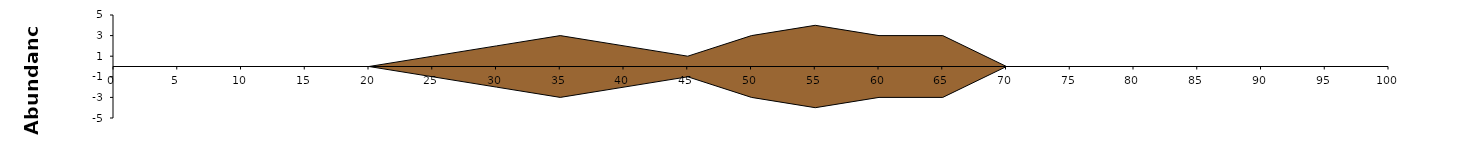
| Category | Series1 | Series2 |
|---|---|---|
| 0.0 | 0 | 0 |
| 5.0 | 0 | 0 |
| 10.0 | 0 | 0 |
| 15.0 | 0 | 0 |
| 20.0 | 0 | 0 |
| 25.0 | 1 | -1 |
| 30.0 | 2 | -2 |
| 35.0 | 3 | -3 |
| 40.0 | 2 | -2 |
| 45.0 | 1 | -1 |
| 50.0 | 3 | -3 |
| 55.0 | 4 | -4 |
| 60.0 | 3 | -3 |
| 65.0 | 3 | -3 |
| 70.0 | 0 | 0 |
| 75.0 | 0 | 0 |
| 80.0 | 0 | 0 |
| 85.0 | 0 | 0 |
| 90.0 | 0 | 0 |
| 95.0 | 0 | 0 |
| 100.0 | 0 | 0 |